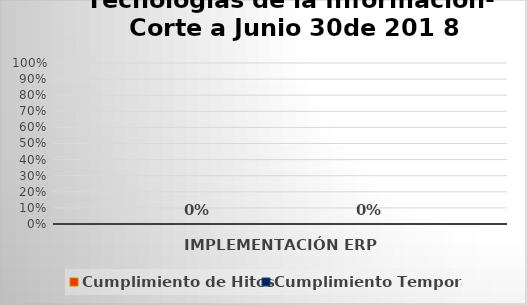
| Category | Cumplimiento de Hitos | Cumplimiento Temporal |
|---|---|---|
| IMPLEMENTACIÓN ERP | 0 | 0 |